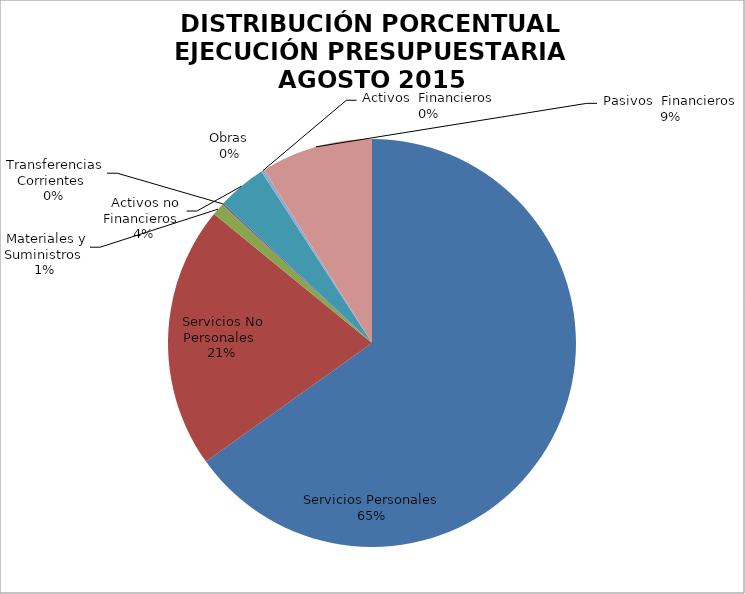
| Category | Series 0 | Series 1 |
|---|---|---|
| Servicios Personales | 10988668.03 | 0.792 |
| Servicios No Personales | 3502996.23 | 0.252 |
| Materiales y Suministros | 166692.45 | 0.012 |
| Transferencias Corrientes | 20000 | 0 |
| Activos no Financieros | 653411.55 | 0.047 |
| Obras | 0 | 0 |
| Activos  Financieros | 44162.38 | 0.003 |
| Pasivos  Financieros | -1494844.22 | -0.108 |